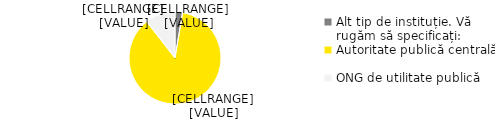
| Category | Total |
|---|---|
| Alt tip de instituție. Vă rugăm să specificați: | 0.026 |
| Autoritate publică centrală | 0.868 |
| ONG de utilitate publică | 0.105 |